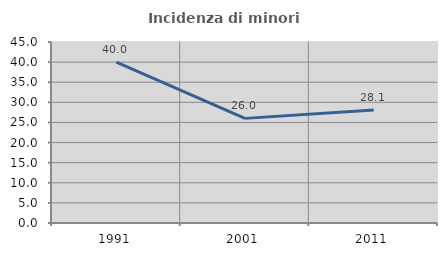
| Category | Incidenza di minori stranieri |
|---|---|
| 1991.0 | 40 |
| 2001.0 | 26.012 |
| 2011.0 | 28.109 |